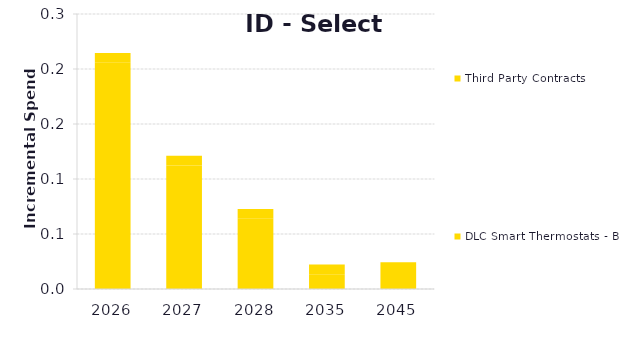
| Category | DLC Smart Thermostats - BYOT | Third Party Contracts |
|---|---|---|
| 2026.0 | 0.206 | 0.009 |
| 2027.0 | 0.112 | 0.009 |
| 2028.0 | 0.064 | 0.009 |
| 2035.0 | 0.013 | 0.009 |
| 2045.0 | 0.016 | 0.009 |